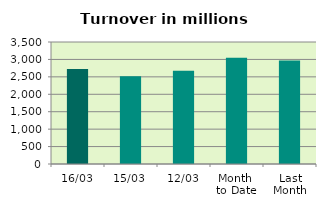
| Category | Series 0 |
|---|---|
| 16/03 | 2726.996 |
| 15/03 | 2519.367 |
| 12/03 | 2673.721 |
| Month 
to Date | 3048.637 |
| Last
Month | 2972.107 |